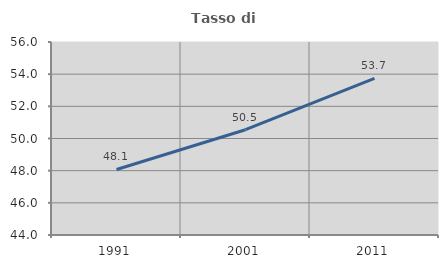
| Category | Tasso di occupazione   |
|---|---|
| 1991.0 | 48.075 |
| 2001.0 | 50.547 |
| 2011.0 | 53.735 |